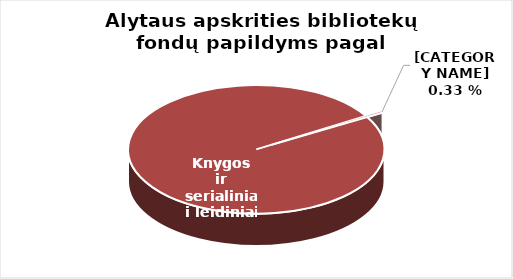
| Category | Series 0 |
|---|---|
| Knygos ir  | 38563 |
| Garsiniai ir regimieji | 128 |